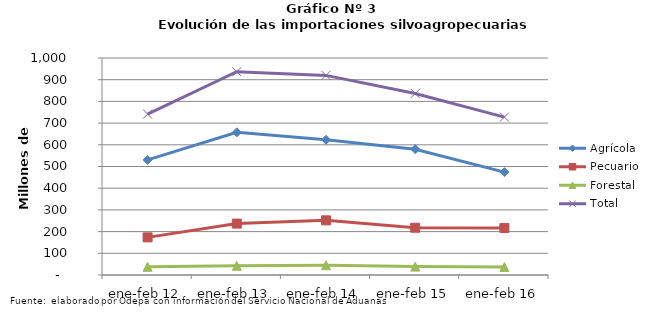
| Category | Agrícola | Pecuario | Forestal | Total |
|---|---|---|---|---|
| ene-feb 12 | 530330 | 173421 | 37783 | 741534 |
| ene-feb 13 | 657278 | 236946 | 42420 | 936644 |
| ene-feb 14 | 623115 | 251806 | 44966 | 919887 |
| ene-feb 15 | 579824 | 217860 | 38674 | 836358 |
| ene-feb 16 | 474068 | 216805 | 36755 | 727628 |